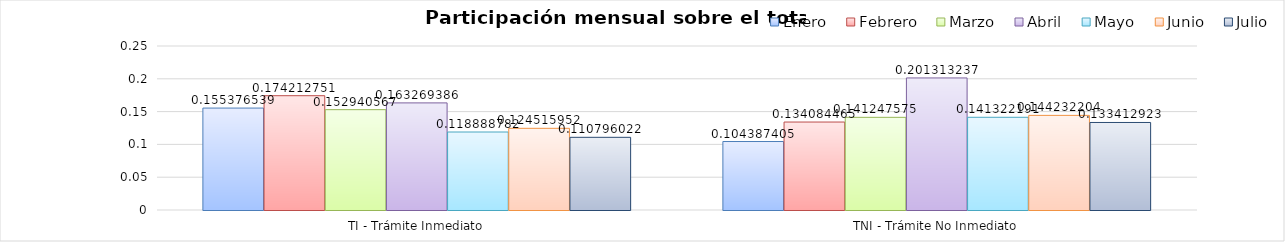
| Category | Enero | Febrero | Marzo | Abril | Mayo | Junio | Julio |
|---|---|---|---|---|---|---|---|
| TI - Trámite Inmediato | 0.155 | 0.174 | 0.153 | 0.163 | 0.119 | 0.125 | 0.111 |
| TNI - Trámite No Inmediato | 0.104 | 0.134 | 0.141 | 0.201 | 0.141 | 0.144 | 0.133 |